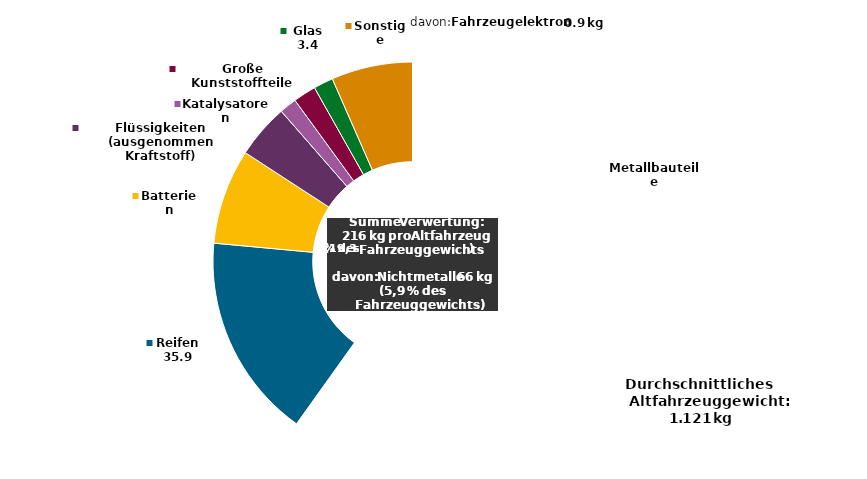
| Category | Series 0 |
|---|---|
| Metallbauteile | 129.597 |
| Reifen | 35.918 |
| Batterien | 16.702 |
| Flüssigkeiten
(ausgenommen Kraftstoff) | 9.5 |
| Katalysatoren | 3.027 |
| Große Kunststoffteile | 4.018 |
| Glas | 3.444 |
| Sonstige | 14.241 |